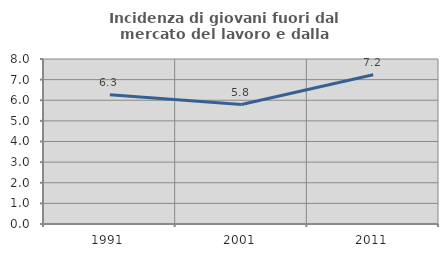
| Category | Incidenza di giovani fuori dal mercato del lavoro e dalla formazione  |
|---|---|
| 1991.0 | 6.263 |
| 2001.0 | 5.793 |
| 2011.0 | 7.233 |